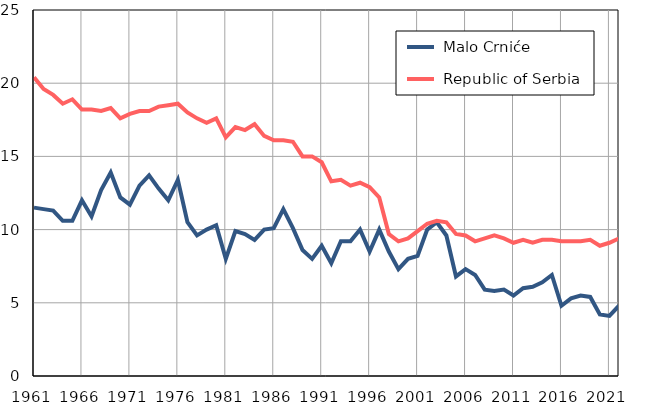
| Category |  Malo Crniće |  Republic of Serbia |
|---|---|---|
| 1961.0 | 11.5 | 20.4 |
| 1962.0 | 11.4 | 19.6 |
| 1963.0 | 11.3 | 19.2 |
| 1964.0 | 10.6 | 18.6 |
| 1965.0 | 10.6 | 18.9 |
| 1966.0 | 12 | 18.2 |
| 1967.0 | 10.9 | 18.2 |
| 1968.0 | 12.7 | 18.1 |
| 1969.0 | 13.9 | 18.3 |
| 1970.0 | 12.2 | 17.6 |
| 1971.0 | 11.7 | 17.9 |
| 1972.0 | 13 | 18.1 |
| 1973.0 | 13.7 | 18.1 |
| 1974.0 | 12.8 | 18.4 |
| 1975.0 | 12 | 18.5 |
| 1976.0 | 13.4 | 18.6 |
| 1977.0 | 10.5 | 18 |
| 1978.0 | 9.6 | 17.6 |
| 1979.0 | 10 | 17.3 |
| 1980.0 | 10.3 | 17.6 |
| 1981.0 | 8 | 16.3 |
| 1982.0 | 9.9 | 17 |
| 1983.0 | 9.7 | 16.8 |
| 1984.0 | 9.3 | 17.2 |
| 1985.0 | 10 | 16.4 |
| 1986.0 | 10.1 | 16.1 |
| 1987.0 | 11.4 | 16.1 |
| 1988.0 | 10.1 | 16 |
| 1989.0 | 8.6 | 15 |
| 1990.0 | 8 | 15 |
| 1991.0 | 8.9 | 14.6 |
| 1992.0 | 7.7 | 13.3 |
| 1993.0 | 9.2 | 13.4 |
| 1994.0 | 9.2 | 13 |
| 1995.0 | 10 | 13.2 |
| 1996.0 | 8.5 | 12.9 |
| 1997.0 | 10 | 12.2 |
| 1998.0 | 8.5 | 9.7 |
| 1999.0 | 7.3 | 9.2 |
| 2000.0 | 8 | 9.4 |
| 2001.0 | 8.2 | 9.9 |
| 2002.0 | 10 | 10.4 |
| 2003.0 | 10.5 | 10.6 |
| 2004.0 | 9.6 | 10.5 |
| 2005.0 | 6.8 | 9.7 |
| 2006.0 | 7.3 | 9.6 |
| 2007.0 | 6.9 | 9.2 |
| 2008.0 | 5.9 | 9.4 |
| 2009.0 | 5.8 | 9.6 |
| 2010.0 | 5.9 | 9.4 |
| 2011.0 | 5.5 | 9.1 |
| 2012.0 | 6 | 9.3 |
| 2013.0 | 6.1 | 9.1 |
| 2014.0 | 6.4 | 9.3 |
| 2015.0 | 6.9 | 9.3 |
| 2016.0 | 4.8 | 9.2 |
| 2017.0 | 5.3 | 9.2 |
| 2018.0 | 5.5 | 9.2 |
| 2019.0 | 5.4 | 9.3 |
| 2020.0 | 4.2 | 8.9 |
| 2021.0 | 4.1 | 9.1 |
| 2022.0 | 4.8 | 9.4 |